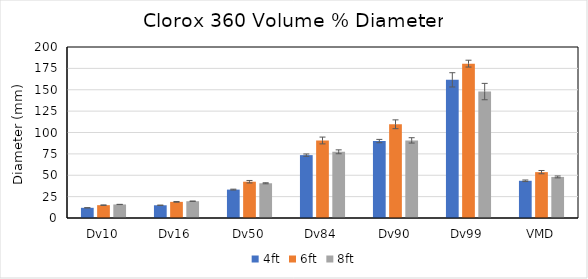
| Category | 4ft | 6ft | 8ft |
|---|---|---|---|
| Dv10 | 11.915 | 15.005 | 15.838 |
| Dv16 | 14.887 | 18.882 | 19.619 |
| Dv50 | 33.206 | 42.447 | 40.618 |
| Dv84 | 73.529 | 90.659 | 77.423 |
| Dv90 | 89.978 | 109.62 | 90.777 |
| Dv99 | 161.577 | 180.547 | 147.869 |
| VMD | 43.523 | 53.644 | 48.031 |